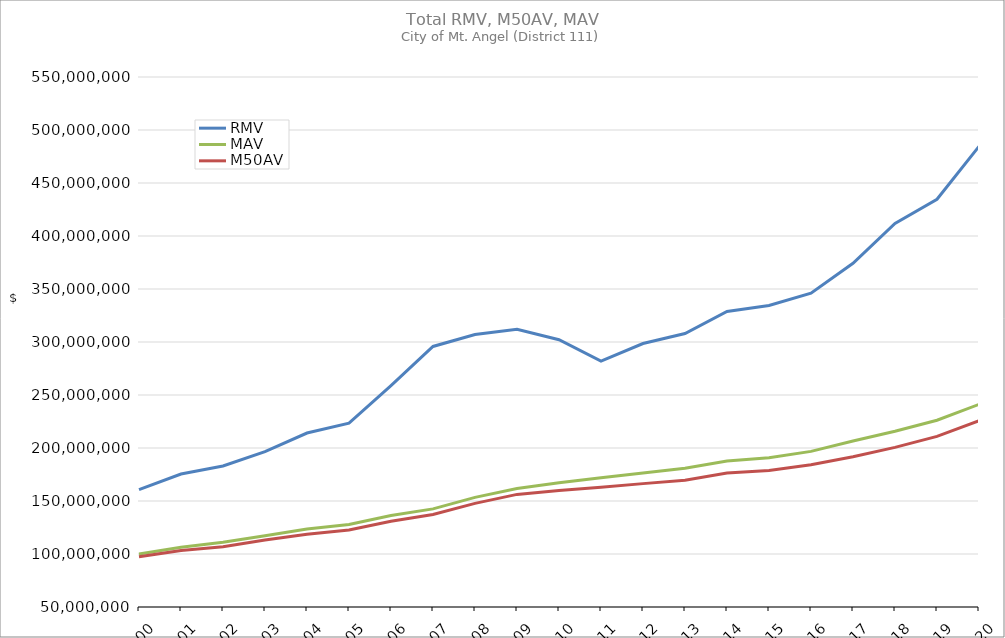
| Category | RMV | MAV | M50AV |
|---|---|---|---|
| 2000.0 | 160704999 | 100030843 | 97371967 |
| 2001.0 | 175493069 | 106440015 | 103235669 |
| 2002.0 | 183071529 | 111092715 | 106916212 |
| 2003.0 | 196487990 | 117247099 | 113141179 |
| 2004.0 | 214136974 | 123559991 | 118527193 |
| 2005.0 | 223479326 | 127792569 | 122667972 |
| 2006.0 | 258841071 | 136261580 | 130910443 |
| 2007.0 | 295793435 | 142543358 | 137345533 |
| 2008.0 | 307129430 | 153458456 | 147758379 |
| 2009.0 | 312081723 | 161781335 | 156227596 |
| 2010.0 | 302106769 | 167259661 | 159900679 |
| 2011.0 | 282049163 | 171910153 | 163079138 |
| 2012.0 | 298551853 | 176361286 | 166388554 |
| 2013.0 | 307942973 | 180836708 | 169681215 |
| 2014.0 | 328753684 | 187762602 | 176369638 |
| 2015.0 | 334404071 | 190813278 | 178794926 |
| 2016.0 | 346055651 | 196819683 | 184291554 |
| 2017.0 | 374252081 | 206560646 | 191669511 |
| 2018.0 | 411840599 | 215766314 | 200577973 |
| 2019.0 | 434639617 | 226167152 | 210932729 |
| 2020.0 | 484489449 | 241171137 | 225703148 |